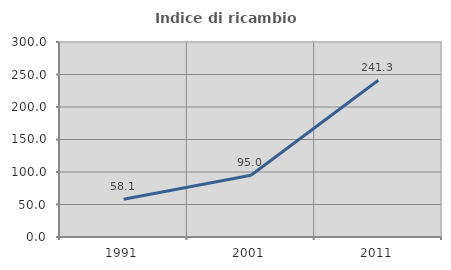
| Category | Indice di ricambio occupazionale  |
|---|---|
| 1991.0 | 58.107 |
| 2001.0 | 94.987 |
| 2011.0 | 241.26 |